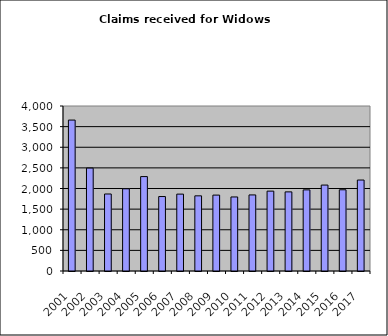
| Category | Series 1 |
|---|---|
| 2001.0 | 3659 |
| 2002.0 | 2495 |
| 2003.0 | 1867 |
| 2004.0 | 1993 |
| 2005.0 | 2289 |
| 2006.0 | 1805 |
| 2007.0 | 1864 |
| 2008.0 | 1822 |
| 2009.0 | 1840 |
| 2010.0 | 1795 |
| 2011.0 | 1844 |
| 2012.0 | 1936 |
| 2013.0 | 1918 |
| 2014.0 | 1967 |
| 2015.0 | 2083 |
| 2016.0 | 1969 |
| 2017.0 | 2205 |